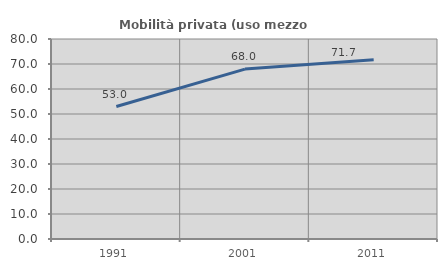
| Category | Mobilità privata (uso mezzo privato) |
|---|---|
| 1991.0 | 52.977 |
| 2001.0 | 67.97 |
| 2011.0 | 71.658 |